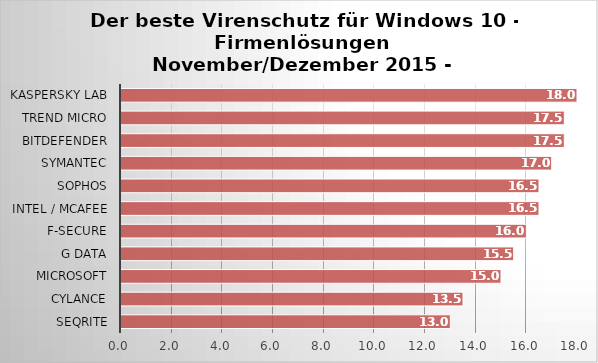
| Category | Series 0 |
|---|---|
| Seqrite | 13 |
| Cylance | 13.5 |
| Microsoft | 15 |
| G Data | 15.5 |
| F-Secure | 16 |
| Intel / McAfee | 16.5 |
| Sophos | 16.5 |
| Symantec | 17 |
| Bitdefender | 17.5 |
| Trend Micro | 17.5 |
| Kaspersky Lab | 18 |